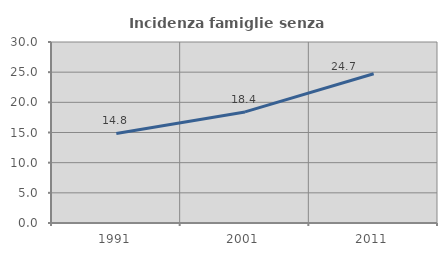
| Category | Incidenza famiglie senza nuclei |
|---|---|
| 1991.0 | 14.841 |
| 2001.0 | 18.41 |
| 2011.0 | 24.748 |